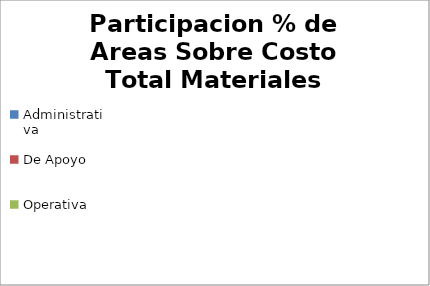
| Category | Participacion % de Areas Sobre Costo Total Materiales Directos |
|---|---|
| Administrativa | 0 |
| De Apoyo | 0 |
| Operativa | 0 |